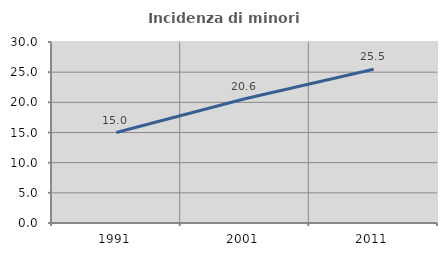
| Category | Incidenza di minori stranieri |
|---|---|
| 1991.0 | 15 |
| 2001.0 | 20.588 |
| 2011.0 | 25.484 |